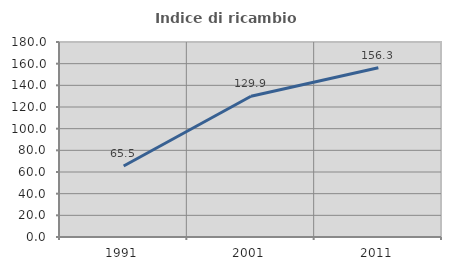
| Category | Indice di ricambio occupazionale  |
|---|---|
| 1991.0 | 65.5 |
| 2001.0 | 129.932 |
| 2011.0 | 156.25 |